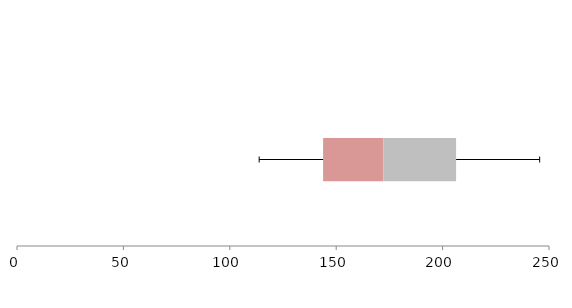
| Category | Series 1 | Series 2 | Series 3 |
|---|---|---|---|
| 0 | 143.854 | 28.329 | 34.156 |